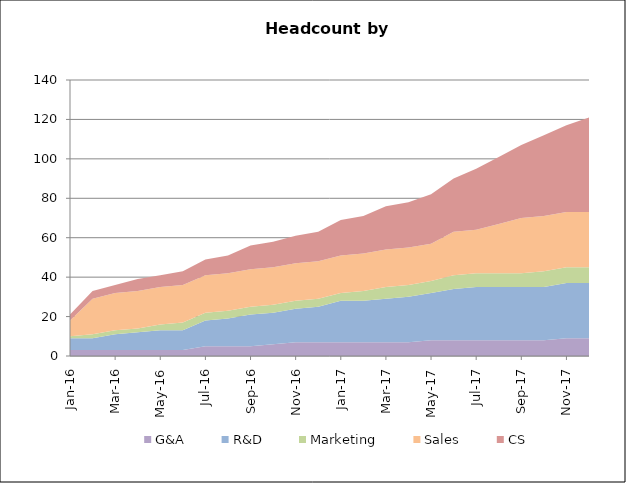
| Category | G&A | R&D | Marketing | Sales | CS |
|---|---|---|---|---|---|
| 2016-01-01 | 3 | 6 | 1 | 8 | 3 |
| 2016-02-01 | 3 | 6 | 2 | 18 | 4 |
| 2016-03-01 | 3 | 8 | 2 | 19 | 4 |
| 2016-04-01 | 3 | 9 | 2 | 19 | 6 |
| 2016-05-01 | 3 | 10 | 3 | 19 | 6 |
| 2016-06-01 | 3 | 10 | 4 | 19 | 7 |
| 2016-07-01 | 5 | 13 | 4 | 19 | 8 |
| 2016-08-01 | 5 | 14 | 4 | 19 | 9 |
| 2016-09-01 | 5 | 16 | 4 | 19 | 12 |
| 2016-10-01 | 6 | 16 | 4 | 19 | 13 |
| 2016-11-01 | 7 | 17 | 4 | 19 | 14 |
| 2016-12-01 | 7 | 18 | 4 | 19 | 15 |
| 2017-01-01 | 7 | 21 | 4 | 19 | 18 |
| 2017-02-01 | 7 | 21 | 5 | 19 | 19 |
| 2017-03-01 | 7 | 22 | 6 | 19 | 22 |
| 2017-04-01 | 7 | 23 | 6 | 19 | 23 |
| 2017-05-01 | 8 | 24 | 6 | 19 | 25 |
| 2017-06-01 | 8 | 26 | 7 | 22 | 27 |
| 2017-07-01 | 8 | 27 | 7 | 22 | 31 |
| 2017-08-01 | 8 | 27 | 7 | 25 | 34 |
| 2017-09-01 | 8 | 27 | 7 | 28 | 37 |
| 2017-10-01 | 8 | 27 | 8 | 28 | 41 |
| 2017-11-01 | 9 | 28 | 8 | 28 | 44 |
| 2017-12-01 | 9 | 28 | 8 | 28 | 48 |